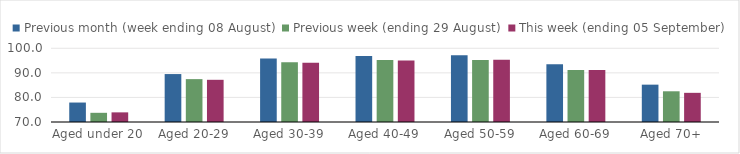
| Category | Previous month (week ending 08 August) | Previous week (ending 29 August) | This week (ending 05 September) |
|---|---|---|---|
| Aged under 20 | 77.92 | 73.74 | 73.92 |
| Aged 20-29 | 89.51 | 87.45 | 87.17 |
| Aged 30-39 | 95.81 | 94.32 | 94.07 |
| Aged 40-49 | 96.85 | 95.22 | 95.06 |
| Aged 50-59 | 97.16 | 95.28 | 95.29 |
| Aged 60-69 | 93.46 | 91.13 | 91.19 |
| Aged 70+ | 85.2 | 82.5 | 81.87 |